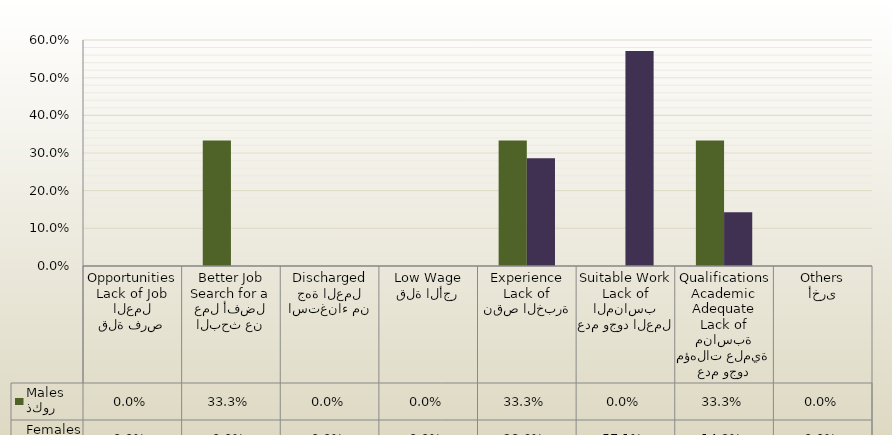
| Category | ذكور
Males | اناث
Females |
|---|---|---|
| قلة فرص العمل
Lack of Job Opportunities | 0 | 0 |
| البحث عن عمل أفضل
Search for a Better Job | 0.333 | 0 |
| استغناء من جهة العمل
Discharged | 0 | 0 |
| قلة الأجر
Low Wage | 0 | 0 |
| نقص الخبرة
Lack of Experience | 0.333 | 0.286 |
| عدم وجود العمل المناسب
Lack of Suitable Work | 0 | 0.571 |
| عدم وجود مؤهلات علمية مناسبة
Lack of Adequate Academic Qualifications | 0.333 | 0.143 |
| أخرى
Others | 0 | 0 |